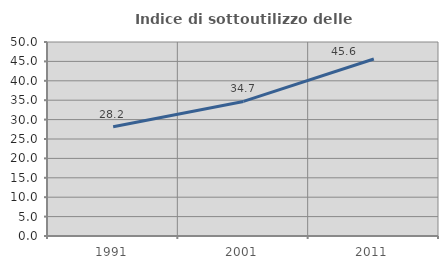
| Category | Indice di sottoutilizzo delle abitazioni  |
|---|---|
| 1991.0 | 28.159 |
| 2001.0 | 34.686 |
| 2011.0 | 45.62 |